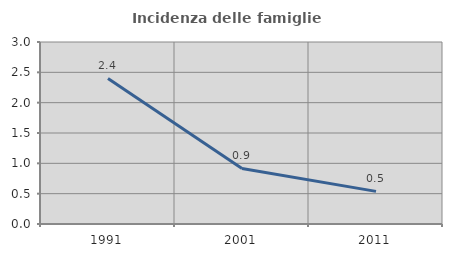
| Category | Incidenza delle famiglie numerose |
|---|---|
| 1991.0 | 2.4 |
| 2001.0 | 0.916 |
| 2011.0 | 0.538 |